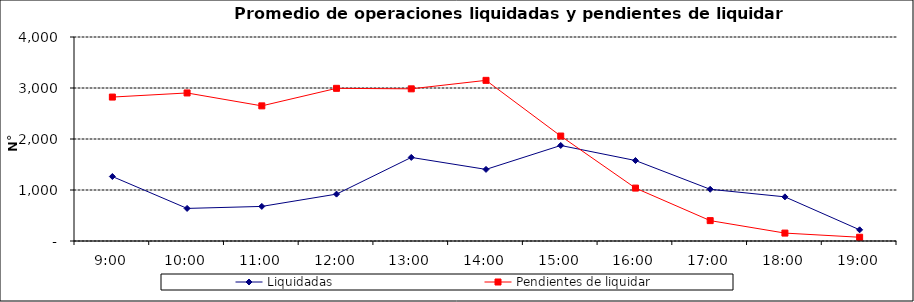
| Category | Liquidadas | Pendientes de liquidar |
|---|---|---|
| 0.375 | 1264.429 | 2822.286 |
| 0.4166666666666667 | 639 | 2902.714 |
| 0.4583333333333333 | 678.143 | 2649.667 |
| 0.5 | 919.143 | 2993.381 |
| 0.5416666666666666 | 1639 | 2983.619 |
| 0.5833333333333334 | 1403.905 | 3150.048 |
| 0.625 | 1873.095 | 2058 |
| 0.6666666666666666 | 1577.857 | 1037.571 |
| 0.7083333333333334 | 1013.952 | 399.571 |
| 0.75 | 865.571 | 155.238 |
| 0.7916666666666666 | 219.143 | 73.429 |